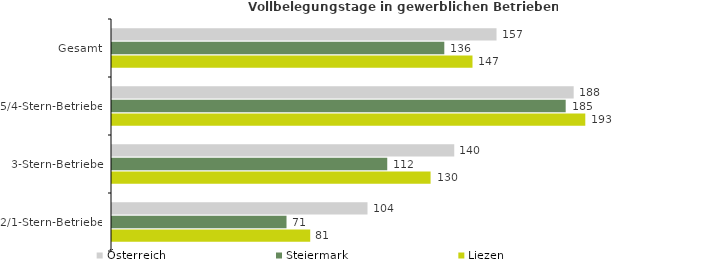
| Category | Österreich | Steiermark | Liezen |
|---|---|---|---|
| Gesamt | 156.946 | 135.634 | 147.141 |
| 5/4-Stern-Betriebe | 188.443 | 185.178 | 193.182 |
| 3-Stern-Betriebe | 139.696 | 112.345 | 130.031 |
| 2/1-Stern-Betriebe | 104.286 | 71.229 | 80.907 |